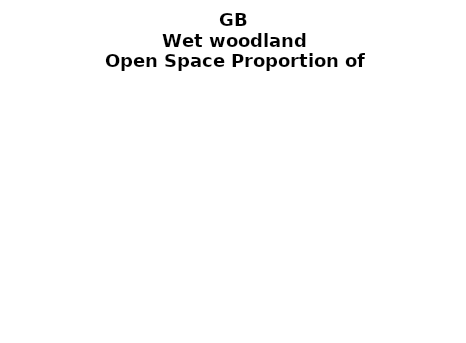
| Category | Wet woodland |
|---|---|
|  ≥ 10ha, < 10%  | 0.161 |
|   ≥ 10ha, 10-25% | 0.1 |
|   ≥ 10ha, > 25 and <50%  | 0.131 |
|   ≥ 10ha, ≥ 50%  | 0.23 |
|  < 10ha, < 10% | 0.042 |
|  < 10ha, 10-25% | 0.039 |
|  < 10ha, > 25 and < 50% | 0.08 |
|  < 10ha, ≥ 50% | 0.217 |